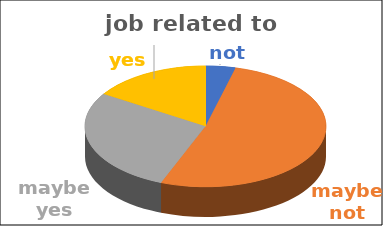
| Category | job related to studies | Series 1 | Series 2 | Series 3 | Series 4 |
|---|---|---|---|---|---|
| not | 0.04 |  |  |  |  |
| maybe not | 0.52 |  |  |  |  |
| maybe yes | 0.28 |  |  |  |  |
| yes | 0.16 |  |  |  |  |